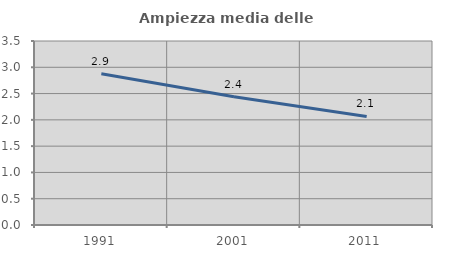
| Category | Ampiezza media delle famiglie |
|---|---|
| 1991.0 | 2.878 |
| 2001.0 | 2.439 |
| 2011.0 | 2.065 |